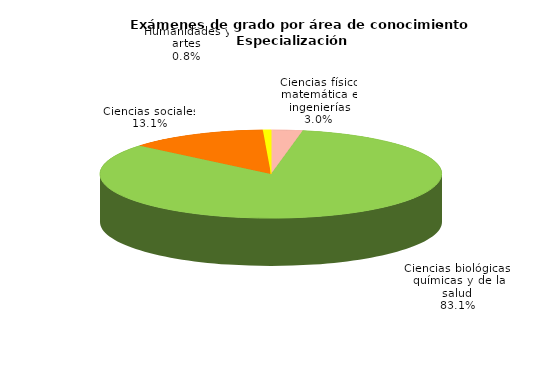
| Category | Series 0 |
|---|---|
| Ciencias físico matemática e ingenierías | 155 |
| Ciencias biológicas, químicas y de la salud | 4357 |
| Ciencias sociales | 688 |
| Humanidades y artes | 40 |